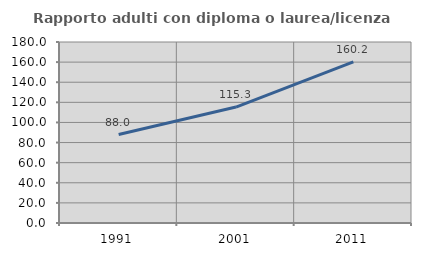
| Category | Rapporto adulti con diploma o laurea/licenza media  |
|---|---|
| 1991.0 | 88.01 |
| 2001.0 | 115.33 |
| 2011.0 | 160.243 |